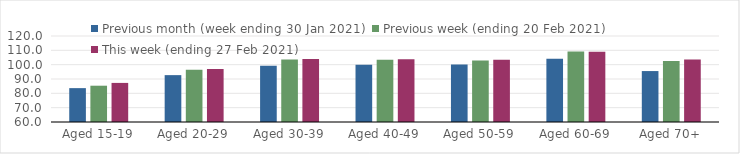
| Category | Previous month (week ending 30 Jan 2021) | Previous week (ending 20 Feb 2021) | This week (ending 27 Feb 2021) |
|---|---|---|---|
| Aged 15-19 | 83.63 | 85.32 | 87.27 |
| Aged 20-29 | 92.7 | 96.45 | 96.91 |
| Aged 30-39 | 99.3 | 103.56 | 104 |
| Aged 40-49 | 99.91 | 103.49 | 103.8 |
| Aged 50-59 | 100.09 | 102.96 | 103.43 |
| Aged 60-69 | 104.14 | 109.18 | 109.05 |
| Aged 70+ | 95.54 | 102.48 | 103.52 |